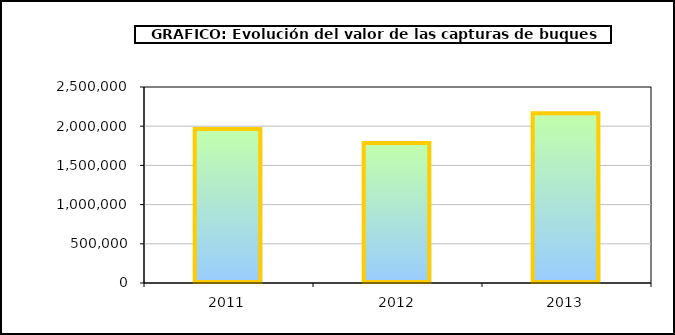
| Category | Series 0 |
|---|---|
| 0 | 1965059.548 |
| 1 | 1784430.541 |
| 2 | 2165361.923 |